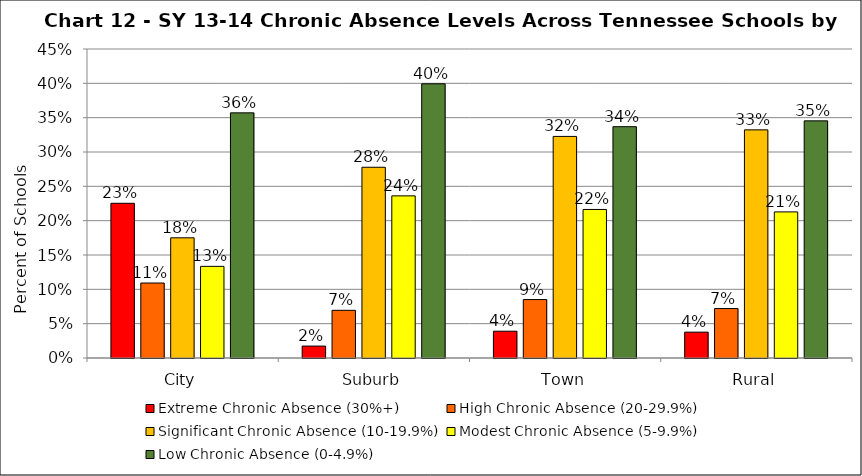
| Category | Extreme Chronic Absence (30%+) | High Chronic Absence (20-29.9%) | Significant Chronic Absence (10-19.9%) | Modest Chronic Absence (5-9.9%) | Low Chronic Absence (0-4.9%) |
|---|---|---|---|---|---|
| 0 | 0.225 | 0.109 | 0.175 | 0.133 | 0.357 |
| 1 | 0.017 | 0.069 | 0.278 | 0.236 | 0.399 |
| 2 | 0.039 | 0.085 | 0.323 | 0.216 | 0.337 |
| 3 | 0.038 | 0.072 | 0.332 | 0.213 | 0.345 |